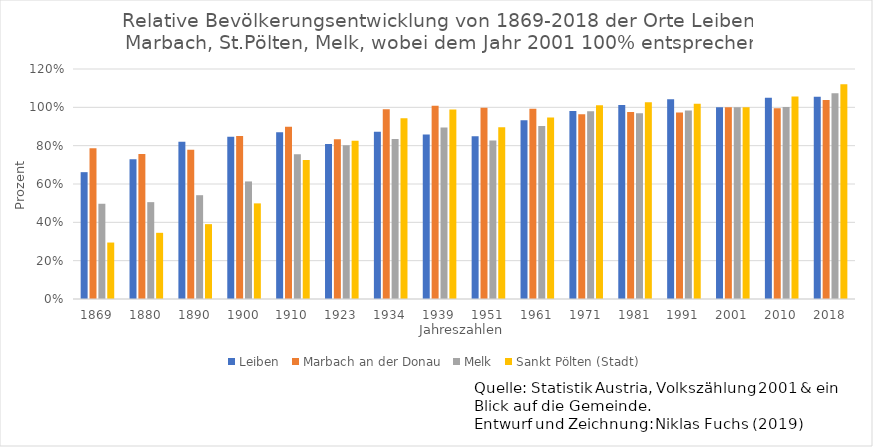
| Category | Leiben | Marbach an der Donau | Melk | Sankt Pölten (Stadt) |
|---|---|---|---|---|
| 1869.0 | 0.662 | 0.786 | 0.497 | 0.295 |
| 1880.0 | 0.729 | 0.757 | 0.505 | 0.345 |
| 1890.0 | 0.82 | 0.778 | 0.542 | 0.391 |
| 1900.0 | 0.846 | 0.851 | 0.613 | 0.499 |
| 1910.0 | 0.87 | 0.898 | 0.755 | 0.726 |
| 1923.0 | 0.808 | 0.833 | 0.802 | 0.826 |
| 1934.0 | 0.873 | 0.99 | 0.834 | 0.943 |
| 1939.0 | 0.859 | 1.008 | 0.894 | 0.989 |
| 1951.0 | 0.849 | 0.998 | 0.827 | 0.896 |
| 1961.0 | 0.933 | 0.993 | 0.903 | 0.947 |
| 1971.0 | 0.981 | 0.965 | 0.98 | 1.011 |
| 1981.0 | 1.012 | 0.975 | 0.969 | 1.026 |
| 1991.0 | 1.043 | 0.974 | 0.984 | 1.018 |
| 2001.0 | 1 | 1 | 1 | 1 |
| 2010.0 | 1.05 | 0.995 | 1.001 | 1.056 |
| 2018.0 | 1.056 | 1.038 | 1.074 | 1.121 |